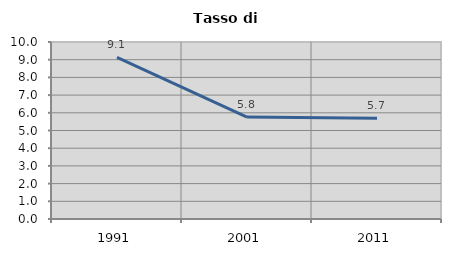
| Category | Tasso di disoccupazione   |
|---|---|
| 1991.0 | 9.128 |
| 2001.0 | 5.757 |
| 2011.0 | 5.697 |